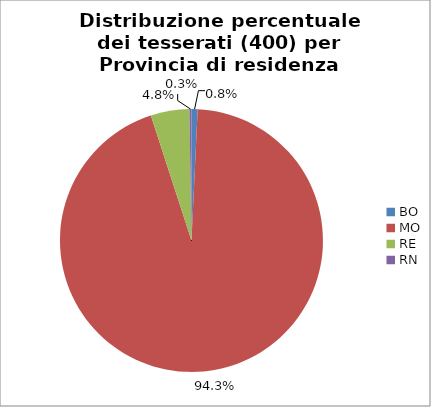
| Category | Nr. Tesserati |
|---|---|
| BO | 3 |
| MO | 377 |
| RE | 19 |
| RN | 1 |